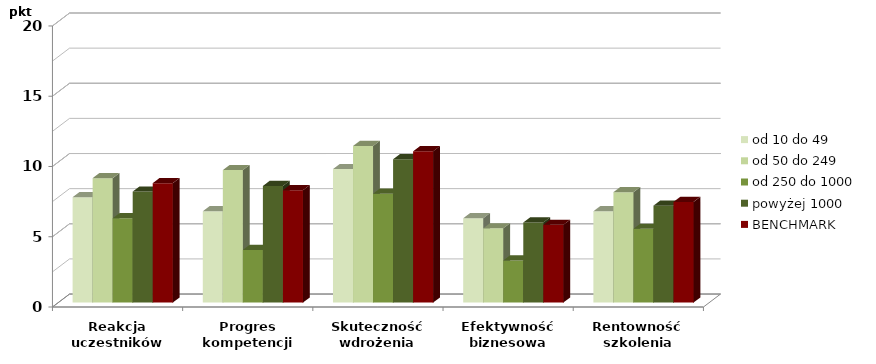
| Category | od 10 do 49 | od 50 do 249 | od 250 do 1000 | powyżej 1000 | BENCHMARK |
|---|---|---|---|---|---|
| Reakcja
uczestników | 7.5 | 8.857 | 6 | 7.9 | 8.5 |
| Progres
kompetencji | 6.5 | 9.429 | 3.75 | 8.3 | 8 |
| Skuteczność
wdrożenia | 9.5 | 11.143 | 7.75 | 10.2 | 10.767 |
| Efektywność
biznesowa | 6 | 5.286 | 3 | 5.7 | 5.533 |
| Rentowność
szkolenia | 6.5 | 7.857 | 5.25 | 6.9 | 7.167 |